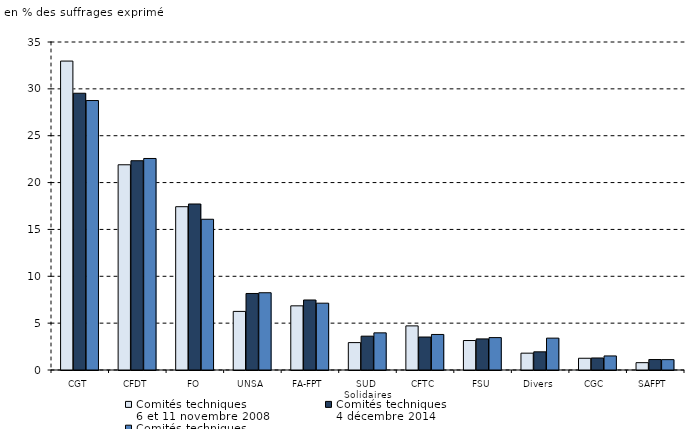
| Category | Comités techniques
6 et 11 novembre 2008 | Comités techniques
4 décembre 2014 | Comités techniques
6 décembre 2018 |
|---|---|---|---|
| CGT | 32.966 | 29.532 | 28.753 |
| CFDT | 21.899 | 22.332 | 22.57 |
| FO | 17.426 | 17.714 | 16.085 |
| UNSA | 6.253 | 8.165 | 8.244 |
| FA-FPT | 6.847 | 7.471 | 7.13 |
| SUD 
Solidaires | 2.924 | 3.611 | 3.964 |
| CFTC | 4.708 | 3.519 | 3.792 |
| FSU | 3.145 | 3.317 | 3.457 |
| Divers | 1.796 | 1.94 | 3.4 |
| CGC  | 1.253 | 1.283 | 1.499 |
| SAFPT | 0.784 | 1.117 | 1.107 |